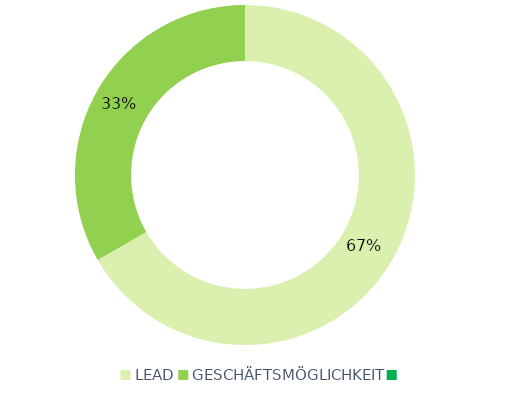
| Category | Series 0 |
|---|---|
| LEAD | 44 |
| GESCHÄFTSMÖGLICHKEIT | 22 |